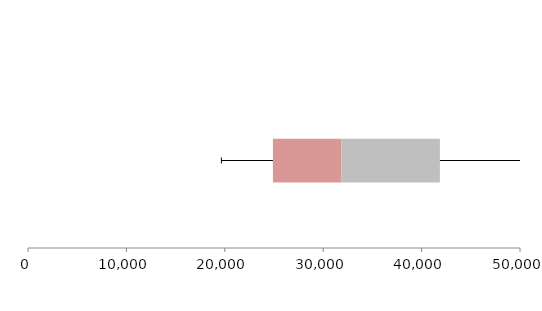
| Category | Series 1 | Series 2 | Series 3 |
|---|---|---|---|
| 0 | 24890.438 | 6967.838 | 9999.92 |